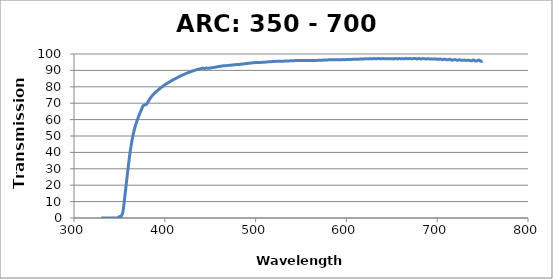
| Category | ARC: 350 - 700 nm |
|---|---|
| 330.0 | 0.037 |
| 332.0 | 0.04 |
| 334.0 | 0.039 |
| 336.0 | 0.04 |
| 338.0 | 0.041 |
| 340.0 | 0.04 |
| 342.0 | 0.042 |
| 344.0 | 0.047 |
| 346.0 | 0.051 |
| 348.0 | 0.11 |
| 350.0 | 0.844 |
| 352.0 | 1.077 |
| 354.0 | 4.11 |
| 356.0 | 13.299 |
| 358.0 | 22.988 |
| 360.0 | 32.473 |
| 362.0 | 40.9 |
| 364.0 | 47.664 |
| 366.0 | 52.886 |
| 368.0 | 56.934 |
| 370.0 | 60.186 |
| 372.0 | 63.098 |
| 374.0 | 65.768 |
| 376.0 | 68.276 |
| 378.0 | 68.952 |
| 380.0 | 69.442 |
| 382.0 | 71.345 |
| 384.0 | 73.019 |
| 386.0 | 74.485 |
| 388.0 | 75.72 |
| 390.0 | 76.794 |
| 392.0 | 77.76 |
| 394.0 | 78.68 |
| 396.0 | 79.561 |
| 398.0 | 80.388 |
| 400.0 | 81.193 |
| 402.0 | 81.908 |
| 404.0 | 82.572 |
| 406.0 | 83.261 |
| 408.0 | 83.905 |
| 410.0 | 84.522 |
| 412.0 | 85.102 |
| 414.0 | 85.659 |
| 416.0 | 86.243 |
| 418.0 | 86.777 |
| 420.0 | 87.266 |
| 422.0 | 87.783 |
| 424.0 | 88.252 |
| 426.0 | 88.688 |
| 428.0 | 89.099 |
| 430.0 | 89.499 |
| 432.0 | 89.891 |
| 434.0 | 90.241 |
| 436.0 | 90.557 |
| 438.0 | 90.857 |
| 440.0 | 91.098 |
| 442.0 | 91.354 |
| 444.0 | 91.177 |
| 446.0 | 91.465 |
| 448.0 | 91.246 |
| 450.0 | 91.474 |
| 452.0 | 91.673 |
| 454.0 | 91.821 |
| 456.0 | 92.012 |
| 458.0 | 92.238 |
| 460.0 | 92.416 |
| 462.0 | 92.587 |
| 464.0 | 92.76 |
| 466.0 | 92.87 |
| 468.0 | 92.923 |
| 470.0 | 93.045 |
| 472.0 | 93.144 |
| 474.0 | 93.245 |
| 476.0 | 93.401 |
| 478.0 | 93.513 |
| 480.0 | 93.577 |
| 482.0 | 93.64 |
| 484.0 | 93.766 |
| 486.0 | 93.917 |
| 488.0 | 94.052 |
| 490.0 | 94.174 |
| 492.0 | 94.314 |
| 494.0 | 94.45 |
| 496.0 | 94.571 |
| 498.0 | 94.687 |
| 500.0 | 94.749 |
| 502.0 | 94.776 |
| 504.0 | 94.836 |
| 506.0 | 94.892 |
| 508.0 | 94.947 |
| 510.0 | 95.013 |
| 512.0 | 95.112 |
| 514.0 | 95.232 |
| 516.0 | 95.303 |
| 518.0 | 95.352 |
| 520.0 | 95.414 |
| 522.0 | 95.509 |
| 524.0 | 95.546 |
| 526.0 | 95.57 |
| 528.0 | 95.631 |
| 530.0 | 95.635 |
| 532.0 | 95.672 |
| 534.0 | 95.714 |
| 536.0 | 95.778 |
| 538.0 | 95.825 |
| 540.0 | 95.904 |
| 542.0 | 95.95 |
| 544.0 | 95.968 |
| 546.0 | 96.019 |
| 548.0 | 96.011 |
| 550.0 | 96.066 |
| 552.0 | 96.022 |
| 554.0 | 96.031 |
| 556.0 | 96.002 |
| 558.0 | 96.01 |
| 560.0 | 96.041 |
| 562.0 | 96.082 |
| 564.0 | 96.112 |
| 566.0 | 96.062 |
| 568.0 | 96.12 |
| 570.0 | 96.155 |
| 572.0 | 96.244 |
| 574.0 | 96.239 |
| 576.0 | 96.366 |
| 578.0 | 96.343 |
| 580.0 | 96.419 |
| 582.0 | 96.437 |
| 584.0 | 96.472 |
| 586.0 | 96.472 |
| 588.0 | 96.52 |
| 590.0 | 96.514 |
| 592.0 | 96.534 |
| 594.0 | 96.527 |
| 596.0 | 96.593 |
| 598.0 | 96.517 |
| 600.0 | 96.607 |
| 602.0 | 96.599 |
| 604.0 | 96.726 |
| 606.0 | 96.711 |
| 608.0 | 96.799 |
| 610.0 | 96.783 |
| 612.0 | 96.835 |
| 614.0 | 96.864 |
| 616.0 | 96.944 |
| 618.0 | 96.961 |
| 620.0 | 97.007 |
| 622.0 | 97.104 |
| 624.0 | 97.014 |
| 626.0 | 97.13 |
| 628.0 | 97.042 |
| 630.0 | 97.201 |
| 632.0 | 97.132 |
| 634.0 | 97.177 |
| 636.0 | 97.186 |
| 638.0 | 97.072 |
| 640.0 | 97.207 |
| 642.0 | 97.077 |
| 644.0 | 97.183 |
| 646.0 | 97.099 |
| 648.0 | 97.083 |
| 650.0 | 97.169 |
| 652.0 | 96.982 |
| 654.0 | 97.226 |
| 656.0 | 97.014 |
| 658.0 | 97.238 |
| 660.0 | 97.107 |
| 662.0 | 97.131 |
| 664.0 | 97.143 |
| 666.0 | 97.242 |
| 668.0 | 97.086 |
| 670.0 | 97.286 |
| 672.0 | 97.041 |
| 674.0 | 97.204 |
| 676.0 | 97.251 |
| 678.0 | 96.977 |
| 680.0 | 97.32 |
| 682.0 | 96.888 |
| 684.0 | 97.188 |
| 686.0 | 97.116 |
| 688.0 | 96.959 |
| 690.0 | 97.154 |
| 692.0 | 96.945 |
| 694.0 | 97.029 |
| 696.0 | 96.868 |
| 698.0 | 97.032 |
| 700.0 | 96.751 |
| 702.0 | 96.82 |
| 704.0 | 96.935 |
| 706.0 | 96.434 |
| 708.0 | 96.903 |
| 710.0 | 96.572 |
| 712.0 | 96.448 |
| 714.0 | 96.873 |
| 716.0 | 96.193 |
| 718.0 | 96.434 |
| 720.0 | 96.58 |
| 722.0 | 96.102 |
| 724.0 | 96.495 |
| 726.0 | 96.253 |
| 728.0 | 96.175 |
| 730.0 | 96.288 |
| 732.0 | 96.026 |
| 734.0 | 96.241 |
| 736.0 | 96.091 |
| 738.0 | 95.854 |
| 740.0 | 96.407 |
| 742.0 | 95.777 |
| 744.0 | 95.902 |
| 746.0 | 96.333 |
| 748.0 | 95.524 |
| 750.0 | 95.791 |